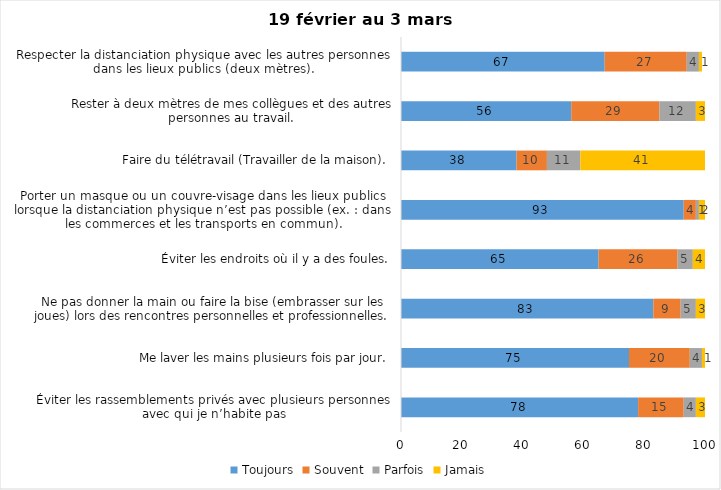
| Category | Toujours | Souvent | Parfois | Jamais |
|---|---|---|---|---|
| Éviter les rassemblements privés avec plusieurs personnes avec qui je n’habite pas | 78 | 15 | 4 | 3 |
| Me laver les mains plusieurs fois par jour. | 75 | 20 | 4 | 1 |
| Ne pas donner la main ou faire la bise (embrasser sur les joues) lors des rencontres personnelles et professionnelles. | 83 | 9 | 5 | 3 |
| Éviter les endroits où il y a des foules. | 65 | 26 | 5 | 4 |
| Porter un masque ou un couvre-visage dans les lieux publics lorsque la distanciation physique n’est pas possible (ex. : dans les commerces et les transports en commun). | 93 | 4 | 1 | 2 |
| Faire du télétravail (Travailler de la maison). | 38 | 10 | 11 | 41 |
| Rester à deux mètres de mes collègues et des autres personnes au travail. | 56 | 29 | 12 | 3 |
| Respecter la distanciation physique avec les autres personnes dans les lieux publics (deux mètres). | 67 | 27 | 4 | 1 |